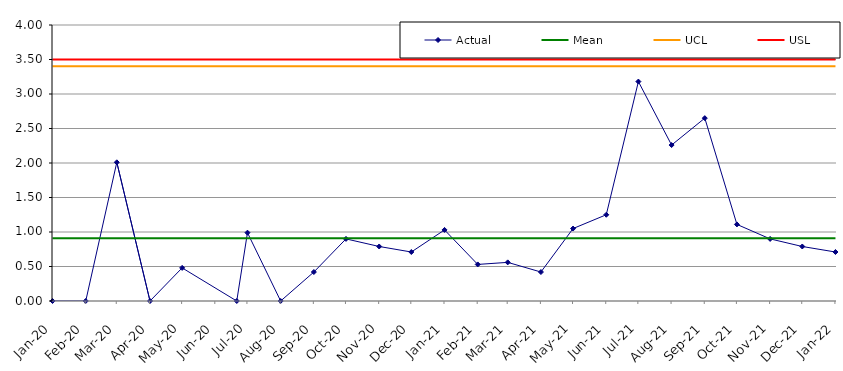
| Category | Actual | Mean | UCL | USL |
|---|---|---|---|---|
| 2020-01-01 | 0 | 0.91 | 3.404 | 3.5 |
| 2020-02-01 | 0 | 0.91 | 3.404 | 3.5 |
| 2020-03-01 | 2.01 | 0.91 | 3.404 | 3.5 |
| 2020-04-01 | 0 | 0.91 | 3.404 | 3.5 |
| 2020-05-01 | 0.48 | 0.91 | 3.404 | 3.5 |
| 2020-06-21 | 0 | 0.91 | 3.404 | 3.5 |
| 2020-07-01 | 0.99 | 0.91 | 3.404 | 3.5 |
| 2020-08-01 | 0 | 0.91 | 3.404 | 3.5 |
| 2020-09-01 | 0.42 | 0.91 | 3.404 | 3.5 |
| 2020-10-01 | 0.9 | 0.91 | 3.404 | 3.5 |
| 2020-11-01 | 0.79 | 0.91 | 3.404 | 3.5 |
| 2020-12-01 | 0.71 | 0.91 | 3.404 | 3.5 |
| 2021-01-01 | 1.03 | 0.91 | 3.404 | 3.5 |
| 2021-02-01 | 0.53 | 0.91 | 3.404 | 3.5 |
| 2021-03-01 | 0.56 | 0.91 | 3.404 | 3.5 |
| 2021-04-01 | 0.42 | 0.91 | 3.404 | 3.5 |
| 2021-05-01 | 1.05 | 0.91 | 3.404 | 3.5 |
| 2021-06-01 | 1.25 | 0.91 | 3.404 | 3.5 |
| 2021-07-01 | 3.18 | 0.91 | 3.404 | 3.5 |
| 2021-08-01 | 2.26 | 0.91 | 3.404 | 3.5 |
| 2021-09-01 | 2.65 | 0.91 | 3.404 | 3.5 |
| 2021-10-01 | 1.11 | 0.91 | 3.404 | 3.5 |
| 2021-11-01 | 0.9 | 0.91 | 3.404 | 3.5 |
| 2021-12-01 | 0.79 | 0.91 | 3.404 | 3.5 |
| 2022-01-01 | 0.71 | 0.91 | 3.404 | 3.5 |